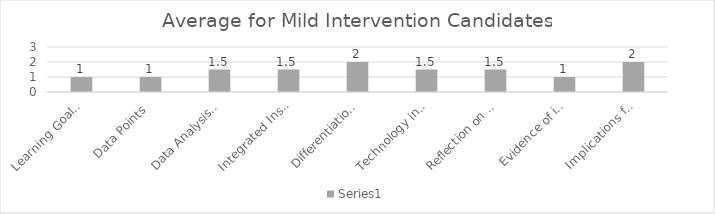
| Category | Series 2 |
|---|---|
| Learning Goals Aligned with Pre-/Post-assessments ACEI 4.0 | 1 |
| Data Points | 1 |
| Data Analysis for Pedagogical Decisions ACEI 4.0 | 1.5 |
| Integrated Instruction ACEI 3.1 | 1.5 |
| Differentiation based on knowledge of individual learning ACEI 3.2 | 2 |
| Technology integration | 1.5 |
| Reflection on pedagogical decisions ACEI 1.0 | 1.5 |
| Evidence of impact on student learning ACEI 5.1 | 1 |
| Implications for teaching and professional development ACEI 5.1 | 2 |